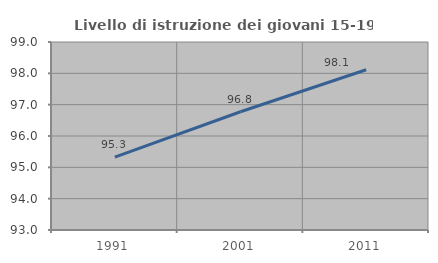
| Category | Livello di istruzione dei giovani 15-19 anni |
|---|---|
| 1991.0 | 95.327 |
| 2001.0 | 96.774 |
| 2011.0 | 98.113 |